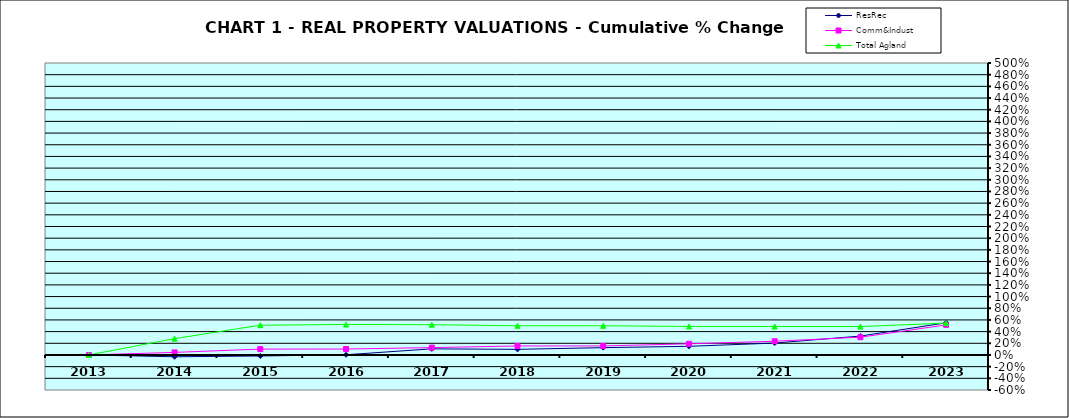
| Category | ResRec | Comm&Indust | Total Agland |
|---|---|---|---|
| 2013.0 | 0 | 0 | 0 |
| 2014.0 | -0.031 | 0.044 | 0.279 |
| 2015.0 | -0.018 | 0.1 | 0.51 |
| 2016.0 | 0.004 | 0.102 | 0.523 |
| 2017.0 | 0.105 | 0.126 | 0.518 |
| 2018.0 | 0.096 | 0.154 | 0.5 |
| 2019.0 | 0.125 | 0.154 | 0.5 |
| 2020.0 | 0.148 | 0.191 | 0.488 |
| 2021.0 | 0.204 | 0.235 | 0.488 |
| 2022.0 | 0.324 | 0.304 | 0.487 |
| 2023.0 | 0.551 | 0.515 | 0.545 |